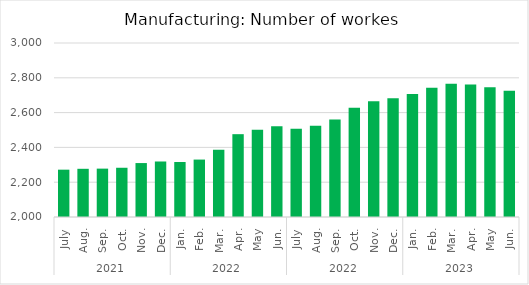
| Category | Number of employees |
|---|---|
| 0 | 2272 |
| 1 | 2277 |
| 2 | 2278 |
| 3 | 2283 |
| 4 | 2310 |
| 5 | 2319 |
| 6 | 2316 |
| 7 | 2330 |
| 8 | 2386 |
| 9 | 2476 |
| 10 | 2502 |
| 11 | 2522 |
| 12 | 2507 |
| 13 | 2525 |
| 14 | 2561 |
| 15 | 2628 |
| 16 | 2665 |
| 17 | 2682 |
| 18 | 2707 |
| 19 | 2743 |
| 20 | 2766 |
| 21 | 2762 |
| 22 | 2746 |
| 23 | 2726 |